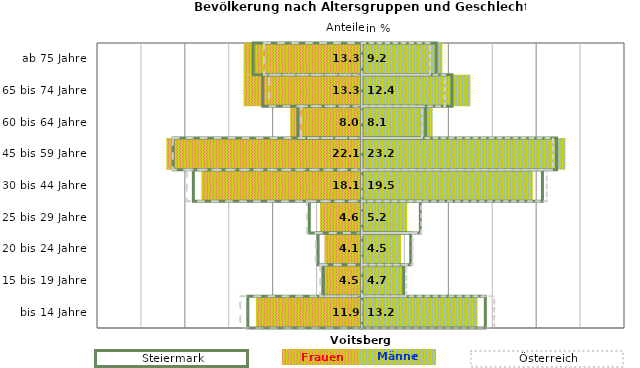
| Category | Frauen | Männer | Frauen Spalte2 | Männer Spalte2 | Frauen Spalte3 | Männer Spalte3 |
|---|---|---|---|---|---|---|
| bis 14 Jahre | -11.9 | 13.2 | 14.1 | -13 | -13.8 | 15.1 |
| 15 bis 19 Jahre | -4.5 | 4.7 | 4.8 | -4.4 | -4.7 | 5.1 |
| 20 bis 24 Jahre | -4.1 | 4.5 | 5.6 | -5 | -5.2 | 5.8 |
| 25 bis 29 Jahre | -4.6 | 5.2 | 6.7 | -6 | -6.2 | 6.8 |
| 30 bis 44 Jahre | -18.1 | 19.5 | 20.6 | -19.2 | -19.9 | 21.1 |
| 45 bis 59 Jahre | -22.1 | 23.2 | 22.2 | -21.5 | -21.5 | 21.8 |
| 60 bis 64 Jahre | -8 | 8.1 | 7.3 | -7.3 | -6.9 | 6.9 |
| 65 bis 74 Jahre | -13.3 | 12.4 | 10.3 | -11.3 | -10.5 | 9.5 |
| ab 75 Jahre | -13.3 | 9.2 | 8.5 | -12.4 | -11.1 | 7.8 |